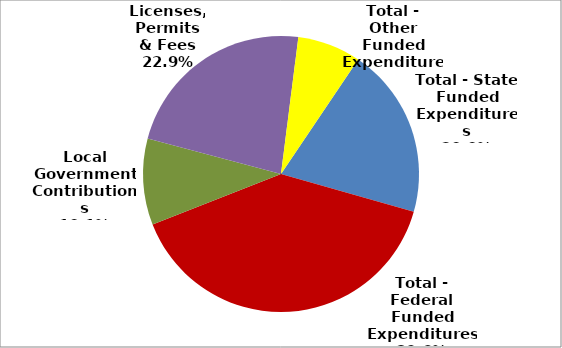
| Category | Series 0 |
|---|---|
| Total - State Funded Expenditures | 458164 |
| Total - Federal Funded Expenditures | 910127 |
| Local Government Contributions | 232095 |
| Licenses, Permits & Fees | 525067 |
| Total - Other Funded Expenditures | 170671 |